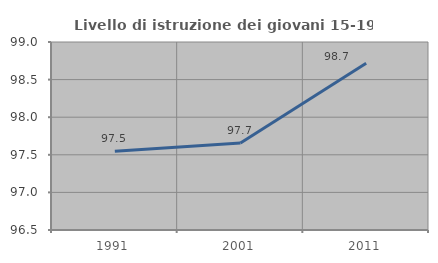
| Category | Livello di istruzione dei giovani 15-19 anni |
|---|---|
| 1991.0 | 97.547 |
| 2001.0 | 97.658 |
| 2011.0 | 98.718 |